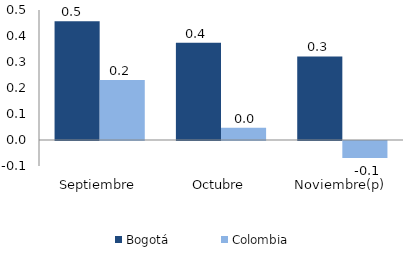
| Category | Bogotá | Colombia |
|---|---|---|
| Septiembre | 0.456 | 0.231 |
| Octubre | 0.374 | 0.047 |
| Noviembre(p) | 0.322 | -0.066 |